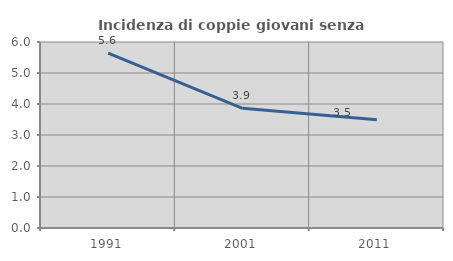
| Category | Incidenza di coppie giovani senza figli |
|---|---|
| 1991.0 | 5.639 |
| 2001.0 | 3.86 |
| 2011.0 | 3.492 |